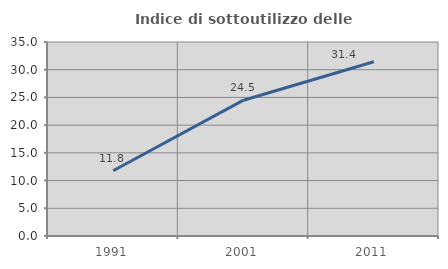
| Category | Indice di sottoutilizzo delle abitazioni  |
|---|---|
| 1991.0 | 11.765 |
| 2001.0 | 24.501 |
| 2011.0 | 31.429 |